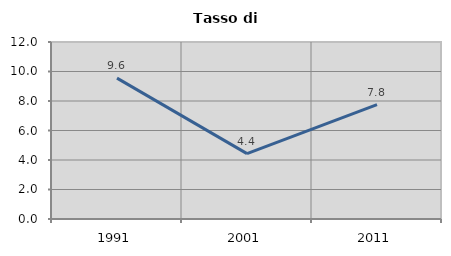
| Category | Tasso di disoccupazione   |
|---|---|
| 1991.0 | 9.551 |
| 2001.0 | 4.433 |
| 2011.0 | 7.755 |